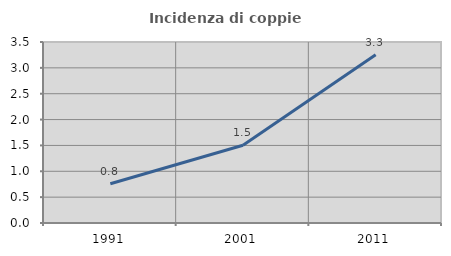
| Category | Incidenza di coppie miste |
|---|---|
| 1991.0 | 0.76 |
| 2001.0 | 1.504 |
| 2011.0 | 3.253 |